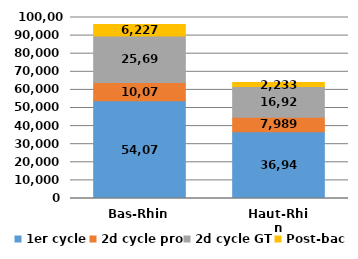
| Category | 1er cycle | 2d cycle pro | 2d cycle GT | Post-bac |
|---|---|---|---|---|
| Bas-Rhin | 54071 | 10075 | 25693 | 6227 |
| Haut-Rhin | 36946 | 7989 | 16922 | 2233 |